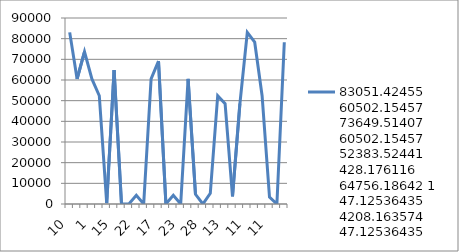
| Category | 83051,42455 60502,15457 73649,51407 60502,15457 52383,52441 428,176116 64756,18642 1 47,12536435 4208,163574 47,12536435 60502,15457 69138,90382 35,55449514 4208,163574 8,482239215 60502,15457 4693,532033 8,482239215 5202,187262 52383,52441 48520,72964 37 |
|---|---|
| 10.0 | 83051.425 |
| 3.0 | 60502.155 |
| 4.0 | 73649.514 |
| 1.0 | 60502.155 |
| 15.0 | 52383.524 |
| 21.0 | 428.176 |
| 15.0 | 64756.186 |
| 15.0 | 1 |
| 2.0 | 47.125 |
| 22.0 | 4208.164 |
| 1.0 | 47.125 |
| 13.0 | 60502.155 |
| 17.0 | 69138.904 |
| 15.0 | 35.554 |
| 26.0 | 4208.164 |
| 23.0 | 8.482 |
| 27.0 | 60502.155 |
| 16.0 | 4693.532 |
| 28.0 | 8.482 |
| 3.0 | 5202.187 |
| 2.0 | 52383.524 |
| 13.0 | 48520.73 |
| 1.0 | 3746.348 |
| 1.0 | 48520.73 |
| 11.0 | 83051.425 |
| 24.0 | 78287.262 |
| 7.0 | 52383.524 |
| 11.0 | 3308.374 |
| 17.0 | 1 |
| 6.0 | 78287.262 |